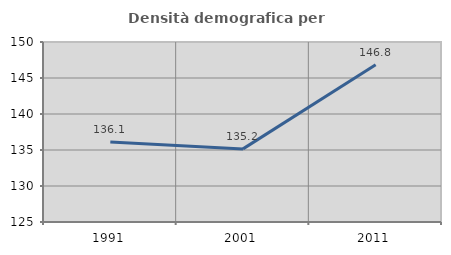
| Category | Densità demografica |
|---|---|
| 1991.0 | 136.127 |
| 2001.0 | 135.154 |
| 2011.0 | 146.828 |